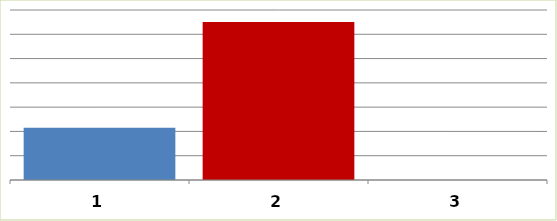
| Category | Series 0 |
|---|---|
| 0 | 10744115.91 |
| 1 | 32521022 |
| 2 | 0 |